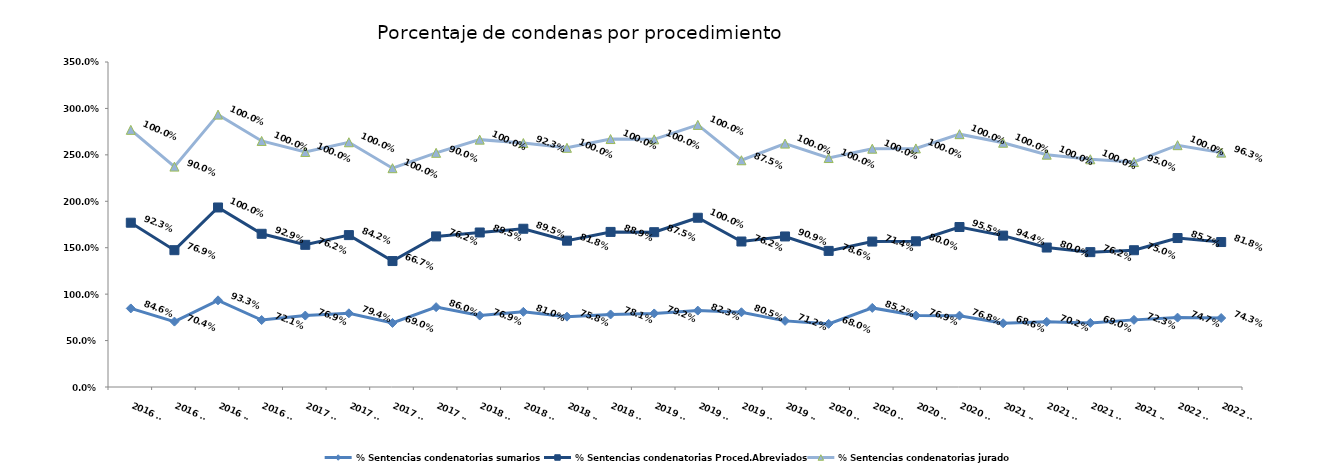
| Category | % Sentencias condenatorias sumarios | % Sentencias condenatorias Proced.Abreviados | % Sentencias condenatorias jurado |
|---|---|---|---|
| 2016 T1 | 0.846 | 0.923 | 1 |
| 2016 T2 | 0.704 | 0.769 | 0.9 |
| 2016 T3 | 0.933 | 1 | 1 |
| 2016 T4 | 0.721 | 0.929 | 1 |
| 2017 T1 | 0.769 | 0.762 | 1 |
| 2017 T2 | 0.794 | 0.842 | 1 |
| 2017 T3 | 0.69 | 0.667 | 1 |
| 2017 T4 | 0.86 | 0.762 | 0.9 |
| 2018 T1 | 0.769 | 0.895 | 1 |
| 2018 T2 | 0.81 | 0.895 | 0.923 |
| 2018 T3 | 0.758 | 0.818 | 1 |
| 2018 T4 | 0.781 | 0.889 | 1 |
| 2019 T1 | 0.792 | 0.875 | 1 |
| 2019 T2 | 0.823 | 1 | 1 |
| 2019 T3 | 0.805 | 0.762 | 0.875 |
| 2019 T4 | 0.712 | 0.909 | 1 |
| 2020 T1 | 0.68 | 0.786 | 1 |
| 2020 T2 | 0.852 | 0.714 | 1 |
| 2020 T3 | 0.769 | 0.8 | 1 |
| 2020 T4 | 0.768 | 0.955 | 1 |
| 2021 T1 | 0.686 | 0.944 | 1 |
| 2021 T2 | 0.702 | 0.8 | 1 |
| 2021 T3 | 0.69 | 0.762 | 1 |
| 2021 T4 | 0.723 | 0.75 | 0.95 |
| 2022 T1 | 0.747 | 0.857 | 1 |
| 2022 T2 | 0.743 | 0.818 | 0.963 |